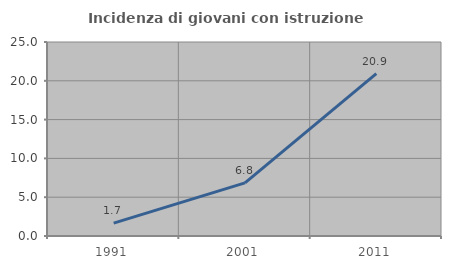
| Category | Incidenza di giovani con istruzione universitaria |
|---|---|
| 1991.0 | 1.667 |
| 2001.0 | 6.849 |
| 2011.0 | 20.93 |